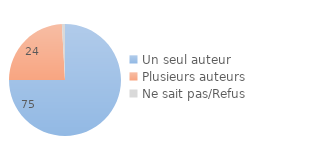
| Category | Series 0 |
|---|---|
| Un seul auteur | 74.993 |
| Plusieurs auteurs | 24.119 |
| Ne sait pas/Refus | 0.888 |